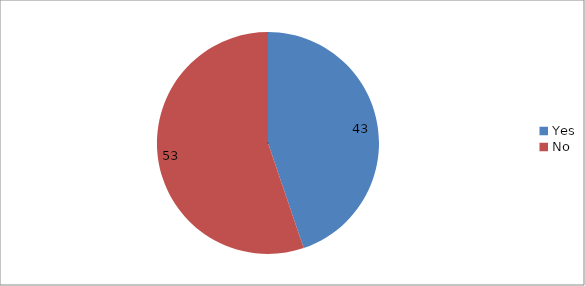
| Category | Series 0 |
|---|---|
| Yes | 43 |
| No | 53 |